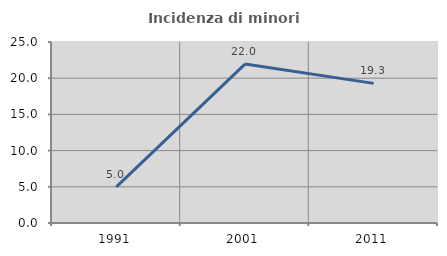
| Category | Incidenza di minori stranieri |
|---|---|
| 1991.0 | 5 |
| 2001.0 | 21.951 |
| 2011.0 | 19.287 |